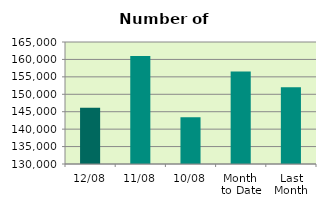
| Category | Series 0 |
|---|---|
| 12/08 | 146170 |
| 11/08 | 160958 |
| 10/08 | 143398 |
| Month 
to Date | 156568.25 |
| Last
Month | 152026.87 |